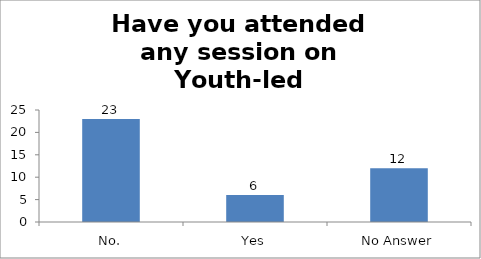
| Category | Have you attended any session on Youth-led Changemaking before? |
|---|---|
| No. | 23 |
| Yes | 6 |
| No Answer | 12 |